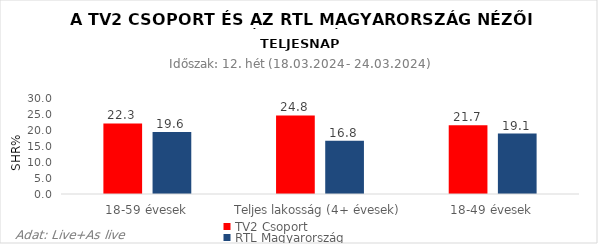
| Category | TV2 Csoport | RTL Magyarország |
|---|---|---|
| 18-59 évesek | 22.3 | 19.6 |
| Teljes lakosság (4+ évesek) | 24.8 | 16.8 |
| 18-49 évesek | 21.7 | 19.1 |